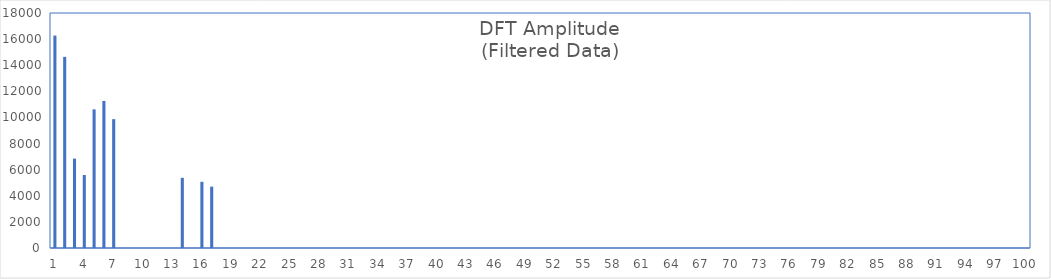
| Category | Series 0 |
|---|---|
| 0 | 16271.438 |
| 1 | 14639.955 |
| 2 | 6846.23 |
| 3 | 5591.555 |
| 4 | 10619.115 |
| 5 | 11266.102 |
| 6 | 9870.136 |
| 7 | 0 |
| 8 | 0 |
| 9 | 0 |
| 10 | 0 |
| 11 | 0 |
| 12 | 0 |
| 13 | 5376.368 |
| 14 | 0 |
| 15 | 5071.117 |
| 16 | 4700.331 |
| 17 | 0 |
| 18 | 0 |
| 19 | 0 |
| 20 | 0 |
| 21 | 0 |
| 22 | 0 |
| 23 | 0 |
| 24 | 0 |
| 25 | 0 |
| 26 | 0 |
| 27 | 0 |
| 28 | 0 |
| 29 | 0 |
| 30 | 0 |
| 31 | 0 |
| 32 | 0 |
| 33 | 0 |
| 34 | 0 |
| 35 | 0 |
| 36 | 0 |
| 37 | 0 |
| 38 | 0 |
| 39 | 0 |
| 40 | 0 |
| 41 | 0 |
| 42 | 0 |
| 43 | 0 |
| 44 | 0 |
| 45 | 0 |
| 46 | 0 |
| 47 | 0 |
| 48 | 0 |
| 49 | 0 |
| 50 | 0 |
| 51 | 0 |
| 52 | 0 |
| 53 | 0 |
| 54 | 0 |
| 55 | 0 |
| 56 | 0 |
| 57 | 0 |
| 58 | 0 |
| 59 | 0 |
| 60 | 0 |
| 61 | 0 |
| 62 | 0 |
| 63 | 0 |
| 64 | 0 |
| 65 | 0 |
| 66 | 0 |
| 67 | 0 |
| 68 | 0 |
| 69 | 0 |
| 70 | 0 |
| 71 | 0 |
| 72 | 0 |
| 73 | 0 |
| 74 | 0 |
| 75 | 0 |
| 76 | 0 |
| 77 | 0 |
| 78 | 0 |
| 79 | 0 |
| 80 | 0 |
| 81 | 0 |
| 82 | 0 |
| 83 | 0 |
| 84 | 0 |
| 85 | 0 |
| 86 | 0 |
| 87 | 0 |
| 88 | 0 |
| 89 | 0 |
| 90 | 0 |
| 91 | 0 |
| 92 | 0 |
| 93 | 0 |
| 94 | 0 |
| 95 | 0 |
| 96 | 0 |
| 97 | 0 |
| 98 | 0 |
| 99 | 0 |